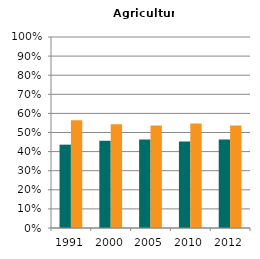
| Category | Male | Female |
|---|---|---|
| 1991.0 | 0.436 | 0.564 |
| 2000.0 | 0.457 | 0.543 |
| 2005.0 | 0.463 | 0.537 |
| 2010.0 | 0.453 | 0.547 |
| 2012.0 | 0.463 | 0.537 |